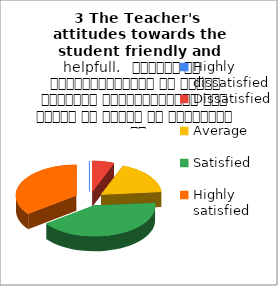
| Category | 3 The Teacher's  attitudes towards the student friendly and helpfull.   शिक्षक का विद्यार्थियों के प्रति व्यवहार मित्रतापूर्ण एवम सहयोग के भावना से परिपूर्ण था |
|---|---|
| Highly dissatisfied | 0 |
| Dissatisfied | 1 |
| Average | 3 |
| Satisfied | 7 |
| Highly satisfied | 6 |